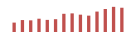
| Category | Importações (2) |
|---|---|
| 0 | 62681.056 |
| 1 | 79621.593 |
| 2 | 77709.867 |
| 3 | 88593.929 |
| 4 | 80744.22 |
| 5 | 85348.563 |
| 6 | 121368.935 |
| 7 | 124143.971 |
| 8 | 115571.707 |
| 9 | 109068.986 |
| 10 | 136178.726 |
| 11 | 153404.387 |
| 12 | 167744.463 |
| 13 | 161744.843 |